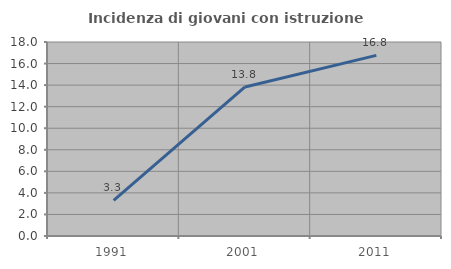
| Category | Incidenza di giovani con istruzione universitaria |
|---|---|
| 1991.0 | 3.308 |
| 2001.0 | 13.828 |
| 2011.0 | 16.761 |